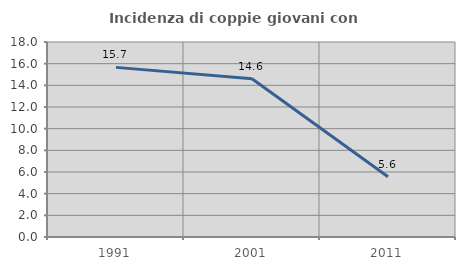
| Category | Incidenza di coppie giovani con figli |
|---|---|
| 1991.0 | 15.658 |
| 2001.0 | 14.607 |
| 2011.0 | 5.556 |